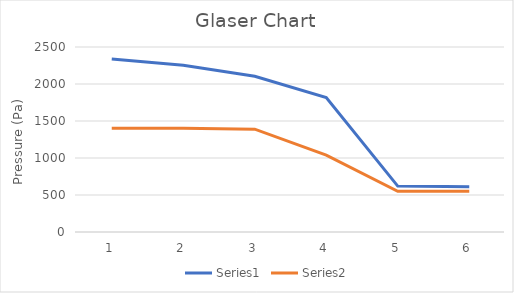
| Category | Series 0 | Series 1 |
|---|---|---|
| 0 | 2338.8 | 1403.28 |
| 1 | 2254.2 | 1403.28 |
| 2 | 2104.4 | 1389.293 |
| 3 | 1818.4 | 1039.621 |
| 4 | 620.4 | 550.08 |
| 5 | 611.2 | 550.08 |